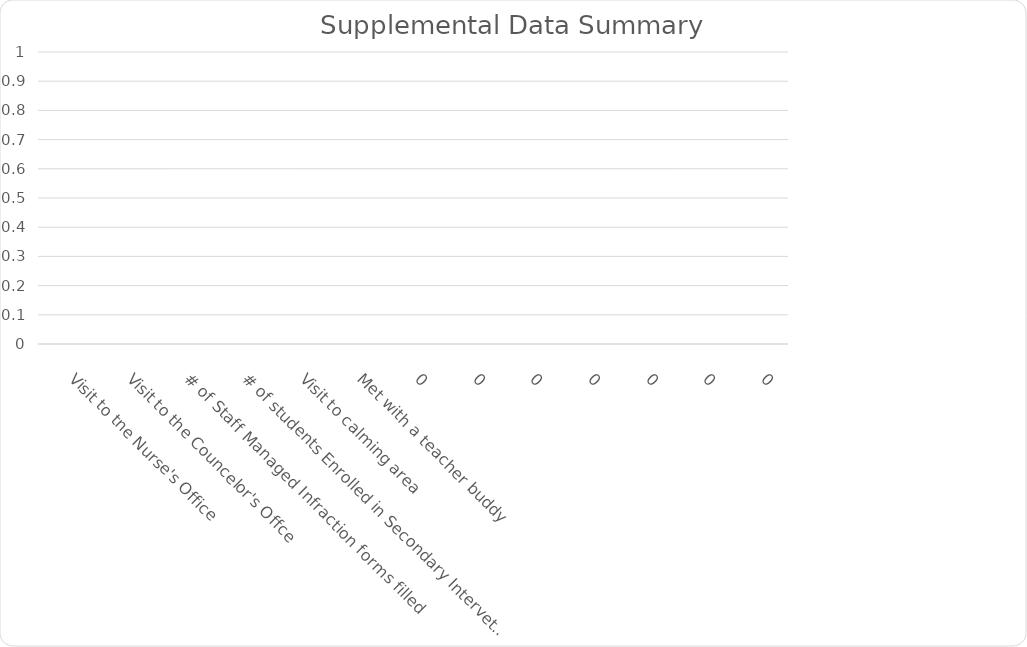
| Category | Series 4 | Series 7 | Series 10 | Series 0 | Series 1 | Series 2 | Series 3 | Series 5 | Series 6 | Series 8 |
|---|---|---|---|---|---|---|---|---|---|---|
| Visit to tne Nurse's Office  |  | 0 | 0 | 0 | 0 | 0 | 0 | 0 | 0 | 0 |
| Visit to the Councelor's Offce |  | 0 | 0 | 0 | 0 | 0 | 0 | 0 | 0 | 0 |
| # of Staff Managed Infraction forms filled |  | 0 | 0 | 0 | 0 | 0 | 0 | 0 | 0 | 0 |
| # of students Enrolled in Secondary Intervetion  |  | 0 | 0 | 0 | 0 | 0 | 0 | 0 | 0 | 0 |
| Visit to calming area |  | 0 | 0 | 0 | 0 | 0 | 0 | 0 | 0 | 0 |
| Met with a teacher buddy |  | 0 | 0 | 0 | 0 | 0 | 0 | 0 | 0 | 0 |
| 0 |  | 0 | 0 | 0 | 0 | 0 | 0 | 0 | 0 | 0 |
| 0 |  | 0 | 0 | 0 | 0 | 0 | 0 | 0 | 0 | 0 |
| 0 |  | 0 | 0 | 0 | 0 | 0 | 0 | 0 | 0 | 0 |
| 0 |  | 0 | 0 | 0 | 0 | 0 | 0 | 0 | 0 | 0 |
| 0 |  | 0 | 0 | 0 | 0 | 0 | 0 | 0 | 0 | 0 |
| 0 |  | 0 | 0 | 0 | 0 | 0 | 0 | 0 | 0 | 0 |
| 0 |  | 0 | 0 | 0 | 0 | 0 | 0 | 0 | 0 | 0 |